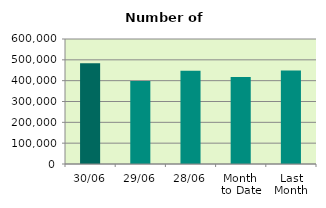
| Category | Series 0 |
|---|---|
| 30/06 | 484150 |
| 29/06 | 398010 |
| 28/06 | 447510 |
| Month 
to Date | 418146.182 |
| Last
Month | 449234.545 |